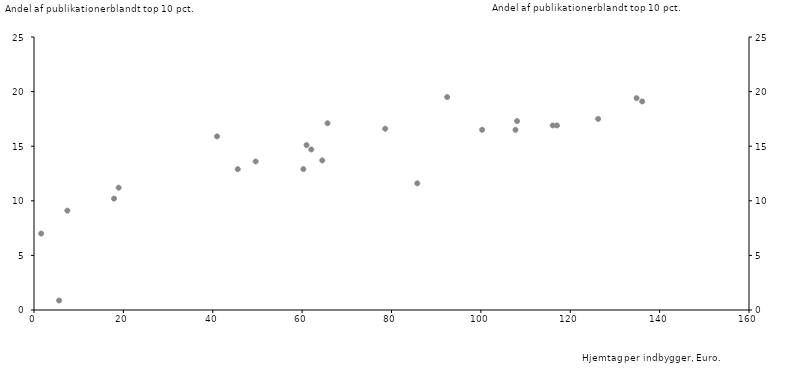
| Category | Serie1 |
|---|---|
| 60.984459791901834 | 15.1 |
| 65.6835126875448 | 17.1 |
| 49.60248800923643 | 13.6 |
| 60.27015959668132 | 12.9 |
| 40.96262860047454 | 15.9 |
| 136.1053868410134 | 19.1 |
| 126.24293963628878 | 17.5 |
| 108.09086412499354 | 17.3 |
| 100.27889987958689 | 16.5 |
| 134.84304646764684 | 19.4 |
| 92.45394479199669 | 19.5 |
| 64.50163734298535 | 13.7 |
| 117.0273674814683 | 16.9 |
| 116.07812238176334 | 16.9 |
| 62.05263443131288 | 14.7 |
| 107.74779090545414 | 16.5 |
| 45.59824406314076 | 12.9 |
| 7.470826497939313 | 9.1 |
| 17.908803291042616 | 10.2 |
| 18.95178516801927 | 11.2 |
| 85.77192030872367 | 11.6 |
| 1.6112832832868946 | 7 |
| 5.61320715281722 | 0.87 |
| 78.59466403585564 | 16.6 |